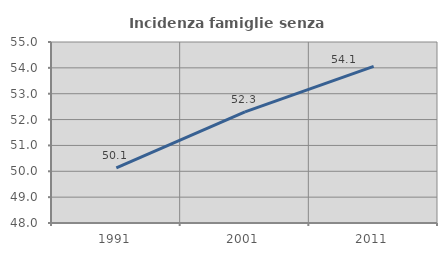
| Category | Incidenza famiglie senza nuclei |
|---|---|
| 1991.0 | 50.132 |
| 2001.0 | 52.296 |
| 2011.0 | 54.057 |